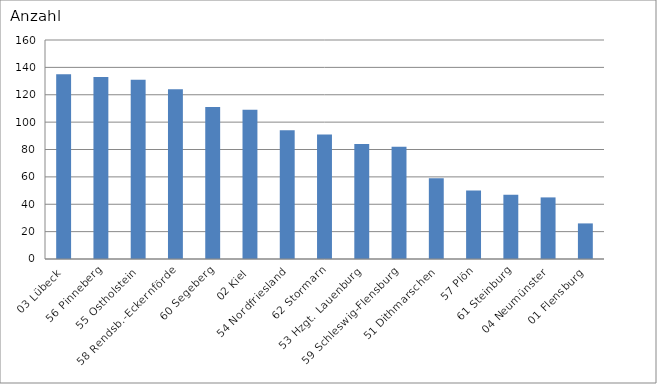
| Category | 03 Lübeck 56 Pinneberg 55 Ostholstein 58 Rendsb.-Eckernförde 60 Segeberg 02 Kiel 54 Nordfriesland 62 Stormarn 53 Hzgt. Lauenburg 59 Schleswig-Flensburg 51 Dithmarschen 57 Plön 61 Steinburg 04 Neumünster 01 Flensburg |
|---|---|
| 03 Lübeck | 135 |
| 56 Pinneberg | 133 |
| 55 Ostholstein | 131 |
| 58 Rendsb.-Eckernförde | 124 |
| 60 Segeberg | 111 |
| 02 Kiel | 109 |
| 54 Nordfriesland | 94 |
| 62 Stormarn | 91 |
| 53 Hzgt. Lauenburg | 84 |
| 59 Schleswig-Flensburg | 82 |
| 51 Dithmarschen | 59 |
| 57 Plön | 50 |
| 61 Steinburg | 47 |
| 04 Neumünster | 45 |
| 01 Flensburg | 26 |